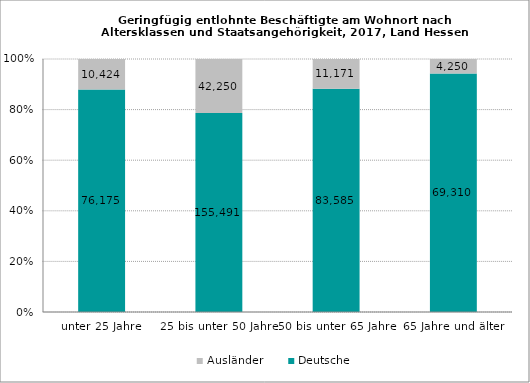
| Category | Deutsche | Ausländer |
|---|---|---|
| unter 25 Jahre | 76175 | 10424 |
| 25 bis unter 50 Jahre | 155491 | 42250 |
| 50 bis unter 65 Jahre | 83585 | 11171 |
| 65 Jahre und älter | 69310 | 4250 |